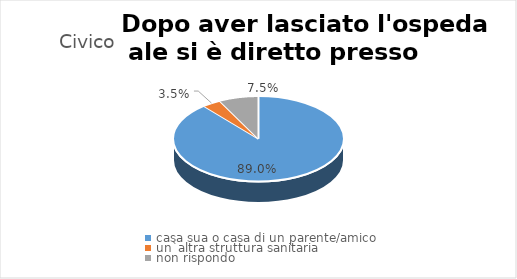
| Category | Civico - Osp -  Palermo - PA |
|---|---|
| casa sua o casa di un parente/amico | 0.89 |
| un`altra struttura sanitaria | 0.035 |
| non rispondo | 0.075 |